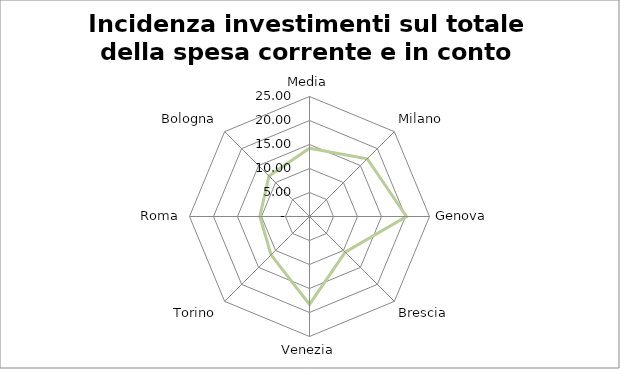
| Category | Incidenza investimenti sul totale della spesa corrente e in conto capitale |
|---|---|
| Media | 14.233 |
| Milano | 17.01 |
| Genova | 20.2 |
| Brescia | 10.51 |
| Venezia | 18.31 |
| Torino | 11.32 |
| Roma | 10.35 |
| Bologna | 11.93 |